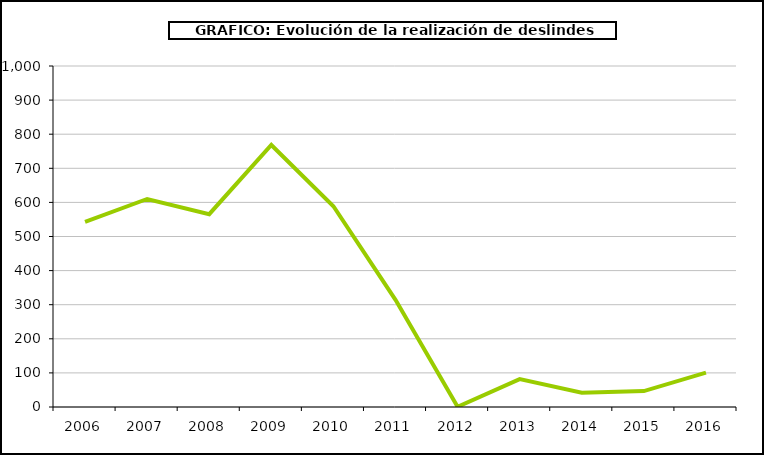
| Category | Series 0 |
|---|---|
| 2006.0 | 542.899 |
| 2007.0 | 609.979 |
| 2008.0 | 565.426 |
| 2009.0 | 768.343 |
| 2010.0 | 588.854 |
| 2011.0 | 314.421 |
| 2012.0 | 0.6 |
| 2013.0 | 81.928 |
| 2014.0 | 41.8 |
| 2015.0 | 46.663 |
| 2016.0 | 100.58 |